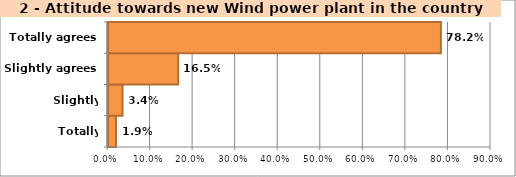
| Category | tech |
|---|---|
| Totally disagrees | 0.019 |
| Slightly disagrees | 0.034 |
| Slightly agrees | 0.165 |
| Totally agrees | 0.782 |